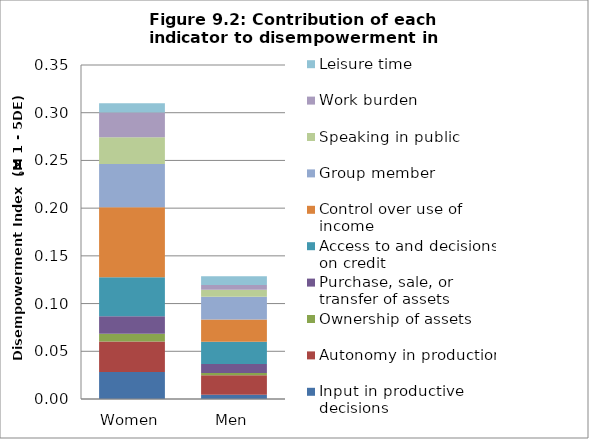
| Category | Input in productive decisions | Autonomy in production | Ownership of assets | Purchase, sale, or transfer of assets | Access to and decisions on credit | Control over use of income | Group member | Speaking in public | Work burden | Leisure time |
|---|---|---|---|---|---|---|---|---|---|---|
| Women | 0.028 | 0.032 | 0.008 | 0.018 | 0.041 | 0.073 | 0.045 | 0.028 | 0.026 | 0.01 |
| Men | 0.005 | 0.02 | 0.002 | 0.009 | 0.023 | 0.023 | 0.024 | 0.007 | 0.005 | 0.009 |